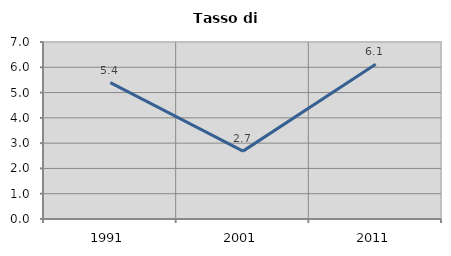
| Category | Tasso di disoccupazione   |
|---|---|
| 1991.0 | 5.392 |
| 2001.0 | 2.684 |
| 2011.0 | 6.123 |